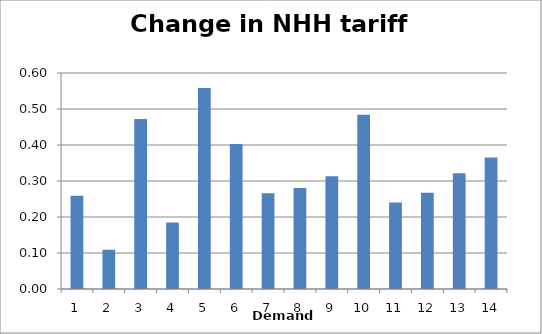
| Category | Change in Energy Tariff (p/kWh)" |
|---|---|
| 0 | 0.259 |
| 1 | 0.109 |
| 2 | 0.472 |
| 3 | 0.185 |
| 4 | 0.559 |
| 5 | 0.402 |
| 6 | 0.266 |
| 7 | 0.28 |
| 8 | 0.313 |
| 9 | 0.484 |
| 10 | 0.241 |
| 11 | 0.268 |
| 12 | 0.322 |
| 13 | 0.365 |